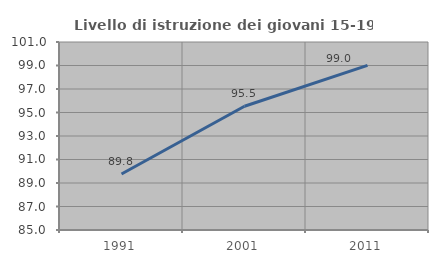
| Category | Livello di istruzione dei giovani 15-19 anni |
|---|---|
| 1991.0 | 89.764 |
| 2001.0 | 95.531 |
| 2011.0 | 99.01 |